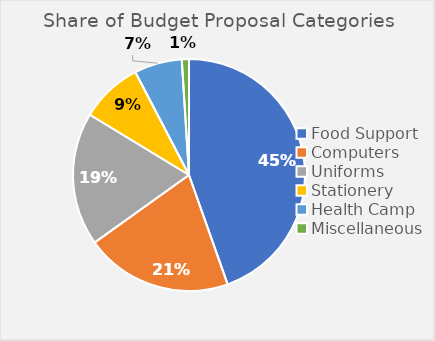
| Category | Series 0 |
|---|---|
| Food Support | 0.446 |
| Computers | 0.205 |
| Uniforms | 0.186 |
| Stationery | 0.087 |
| Health Camp | 0.067 |
| Miscellaneous | 0.01 |